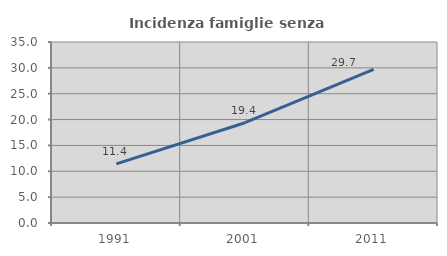
| Category | Incidenza famiglie senza nuclei |
|---|---|
| 1991.0 | 11.435 |
| 2001.0 | 19.389 |
| 2011.0 | 29.712 |